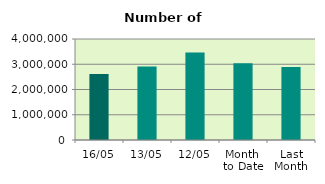
| Category | Series 0 |
|---|---|
| 16/05 | 2610014 |
| 13/05 | 2915674 |
| 12/05 | 3463736 |
| Month 
to Date | 3041156.909 |
| Last
Month | 2895009.158 |